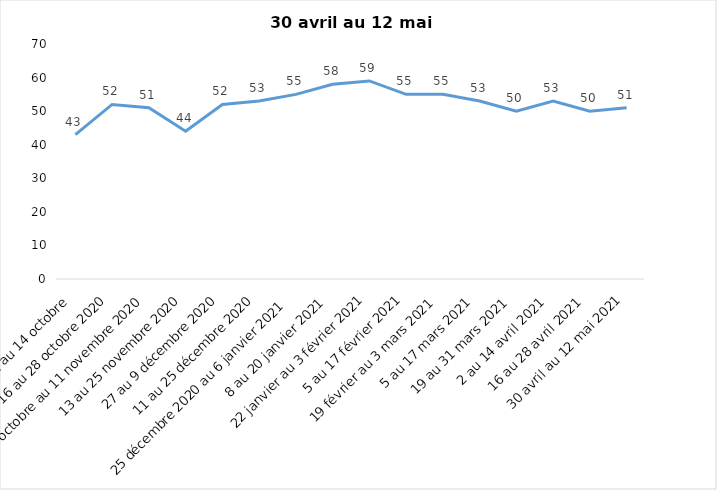
| Category | Toujours aux trois mesures |
|---|---|
| 2 au 14 octobre  | 43 |
| 16 au 28 octobre 2020 | 52 |
| 30 octobre au 11 novembre 2020 | 51 |
| 13 au 25 novembre 2020 | 44 |
| 27 au 9 décembre 2020 | 52 |
| 11 au 25 décembre 2020 | 53 |
| 25 décembre 2020 au 6 janvier 2021 | 55 |
| 8 au 20 janvier 2021 | 58 |
| 22 janvier au 3 février 2021 | 59 |
| 5 au 17 février 2021 | 55 |
| 19 février au 3 mars 2021 | 55 |
| 5 au 17 mars 2021 | 53 |
| 19 au 31 mars 2021 | 50 |
| 2 au 14 avril 2021 | 53 |
| 16 au 28 avril 2021 | 50 |
| 30 avril au 12 mai 2021 | 51 |